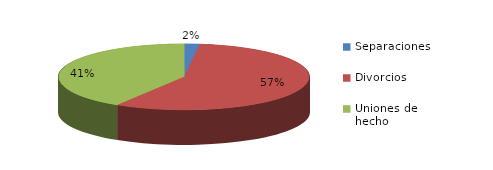
| Category | Series 0 |
|---|---|
| Separaciones | 104 |
| Divorcios | 2987 |
| Uniones de hecho | 2162 |